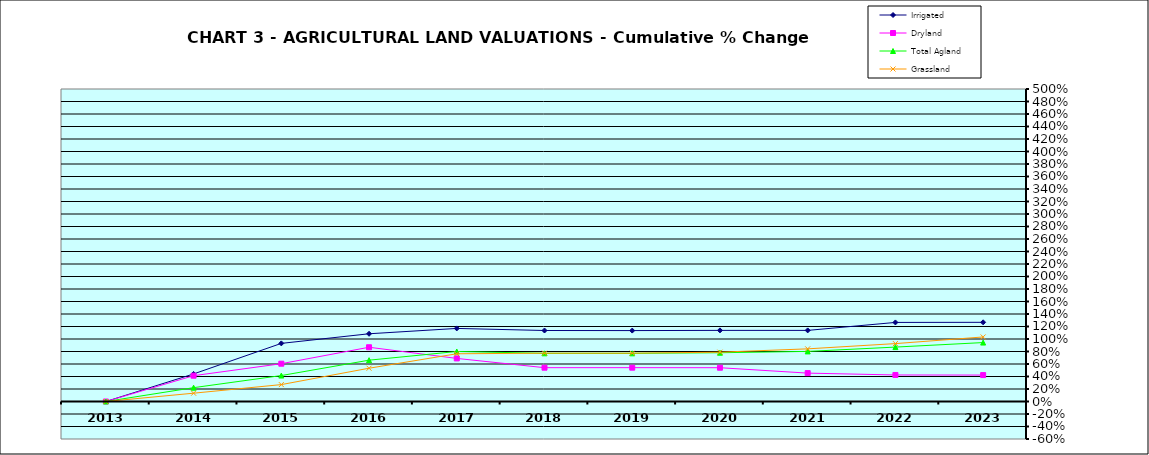
| Category | Irrigated | Dryland | Total Agland | Grassland |
|---|---|---|---|---|
| 2013.0 | 0 | 0 | 0 | 0 |
| 2014.0 | 0.441 | 0.413 | 0.221 | 0.133 |
| 2015.0 | 0.93 | 0.605 | 0.415 | 0.27 |
| 2016.0 | 1.084 | 0.868 | 0.661 | 0.532 |
| 2017.0 | 1.169 | 0.689 | 0.8 | 0.764 |
| 2018.0 | 1.136 | 0.541 | 0.771 | 0.773 |
| 2019.0 | 1.135 | 0.541 | 0.771 | 0.773 |
| 2020.0 | 1.138 | 0.541 | 0.78 | 0.789 |
| 2021.0 | 1.138 | 0.454 | 0.801 | 0.842 |
| 2022.0 | 1.265 | 0.424 | 0.871 | 0.926 |
| 2023.0 | 1.267 | 0.423 | 0.943 | 1.033 |